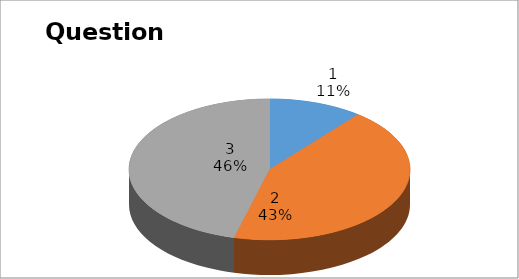
| Category | Series 0 |
|---|---|
| 0 | 4 |
| 1 | 16 |
| 2 | 17 |